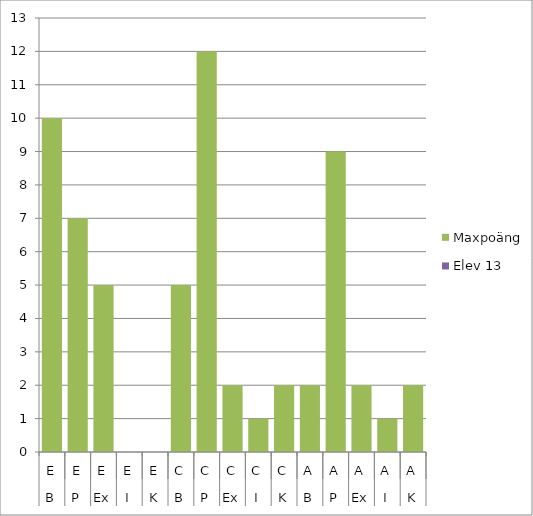
| Category | Maxpoäng | Elev 13 |
|---|---|---|
| 0 | 10 | 0 |
| 1 | 7 | 0 |
| 2 | 5 | 0 |
| 3 | 0 | 0 |
| 4 | 0 | 0 |
| 5 | 5 | 0 |
| 6 | 12 | 0 |
| 7 | 2 | 0 |
| 8 | 1 | 0 |
| 9 | 2 | 0 |
| 10 | 2 | 0 |
| 11 | 9 | 0 |
| 12 | 2 | 0 |
| 13 | 1 | 0 |
| 14 | 2 | 0 |